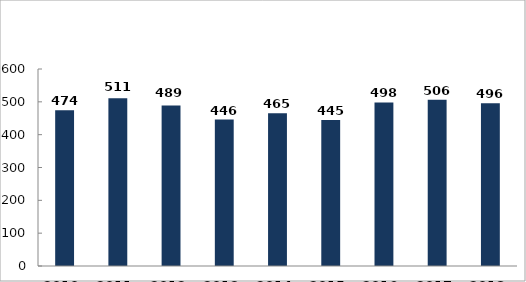
| Category | Könnyen sérült személyek száma (fő) |
|---|---|
| 2010. év | 474 |
| 2011. év | 511 |
| 2012. év | 489 |
| 2013. év | 446 |
| 2014. év | 465 |
| 2015. év | 445 |
| 2016. év | 498 |
| 2017. év | 506 |
| 2018. év | 496 |